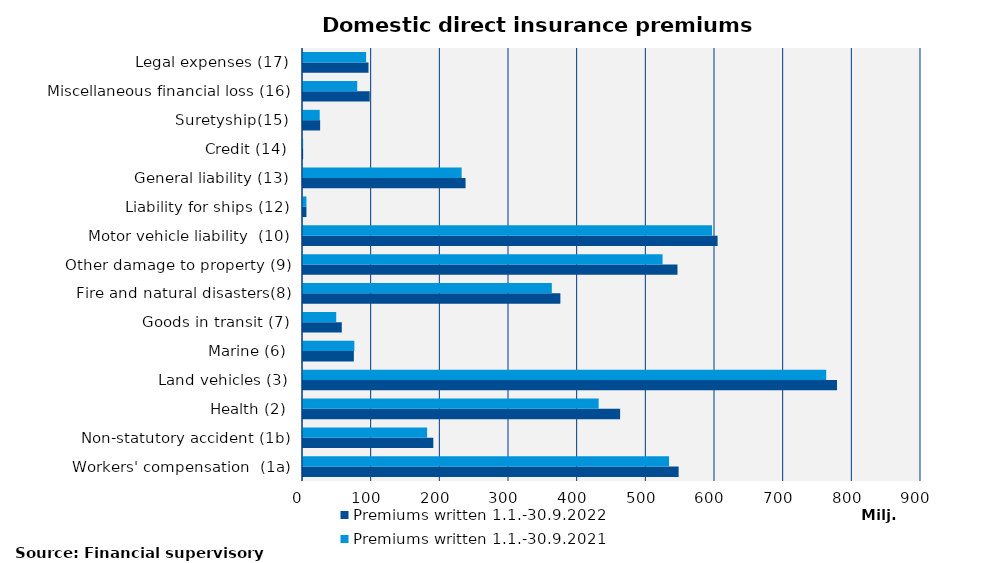
| Category | Premiums written |
|---|---|
| Workers' compensation  (1a) | 533080.547 |
| Non-statutory accident (1b) | 180782.275 |
| Health (2) | 430573.208 |
| Land vehicles (3) | 761963.445 |
| Marine (6) | 74783.445 |
| Goods in transit (7) | 48396.317 |
| Fire and natural disasters(8) | 362357.53 |
| Other damage to property (9) | 523647.256 |
| Motor vehicle liability  (10) | 595709.309 |
| Liability for ships (12) | 5033.968 |
| General liability (13) | 231048.151 |
| Credit (14) | 204.189 |
| Suretyship(15) | 24357.257 |
| Miscellaneous financial loss (16) | 78995.253 |
| Legal expenses (17) | 91908.641 |